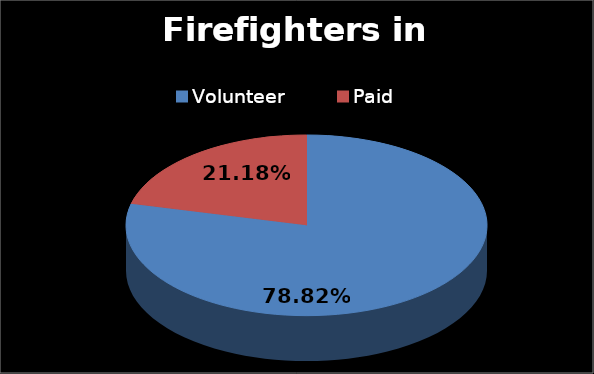
| Category | Series 0 |
|---|---|
| Volunteer | 0.788 |
| Paid | 0.212 |